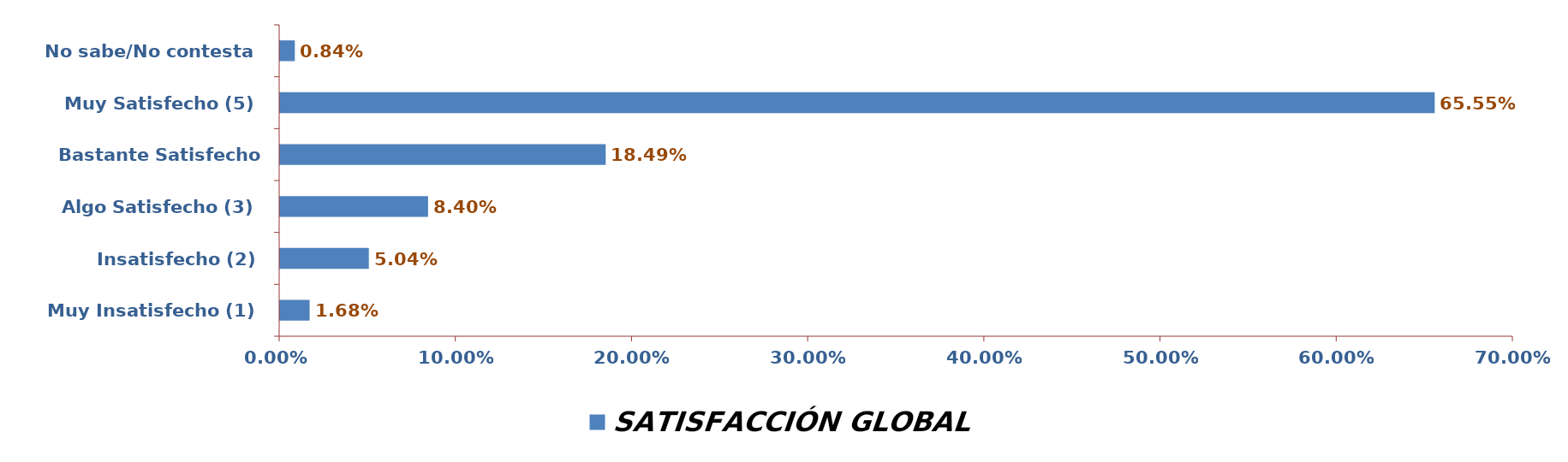
| Category | SATISFACCIÓN GLOBAL |
|---|---|
| Muy Insatisfecho (1) | 0.017 |
| Insatisfecho (2) | 0.05 |
| Algo Satisfecho (3) | 0.084 |
| Bastante Satisfecho (4) | 0.185 |
| Muy Satisfecho (5) | 0.655 |
| No sabe/No contesta | 0.008 |